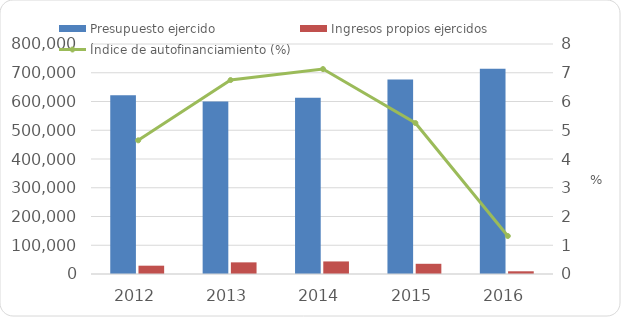
| Category | Presupuesto ejercido | Ingresos propios ejercidos  |
|---|---|---|
| 2012 | 621909.5 | 28915 |
| 2013 | 600163.1 | 40487.2 |
| 2014 | 613052.1 | 43697.9 |
| 2015 | 676403.338 | 35517.936 |
| 2016 | 713725.8 | 9432.4 |